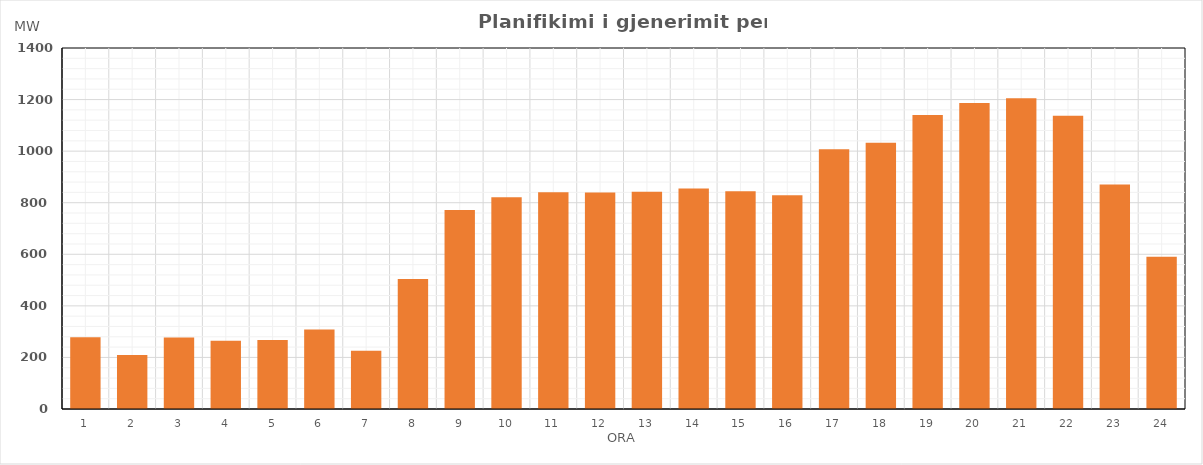
| Category | Max (MW) |
|---|---|
| 0 | 278 |
| 1 | 209 |
| 2 | 276.854 |
| 3 | 264.819 |
| 4 | 267.829 |
| 5 | 307.964 |
| 6 | 226.224 |
| 7 | 504.474 |
| 8 | 771.594 |
| 9 | 821.264 |
| 10 | 840.359 |
| 11 | 839.435 |
| 12 | 842.565 |
| 13 | 855.6 |
| 14 | 844.54 |
| 15 | 829.33 |
| 16 | 1007.73 |
| 17 | 1032.684 |
| 18 | 1139.845 |
| 19 | 1186.99 |
| 20 | 1204.89 |
| 21 | 1137.72 |
| 22 | 870.67 |
| 23 | 590.81 |